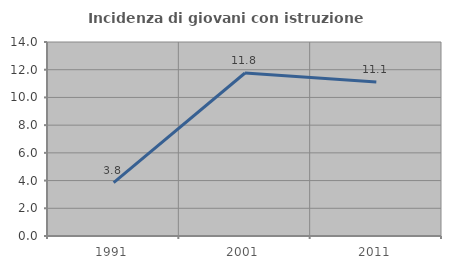
| Category | Incidenza di giovani con istruzione universitaria |
|---|---|
| 1991.0 | 3.846 |
| 2001.0 | 11.765 |
| 2011.0 | 11.111 |